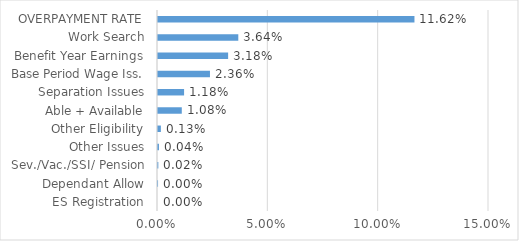
| Category | Series 0 |
|---|---|
| ES Registration | 0 |
| Dependant Allow | 0 |
| Sev./Vac./SSI/ Pension | 0 |
| Other Issues | 0 |
| Other Eligibility | 0.001 |
| Able + Available | 0.011 |
| Separation Issues | 0.012 |
| Base Period Wage Iss. | 0.024 |
| Benefit Year Earnings | 0.032 |
| Work Search | 0.036 |
| OVERPAYMENT RATE | 0.116 |